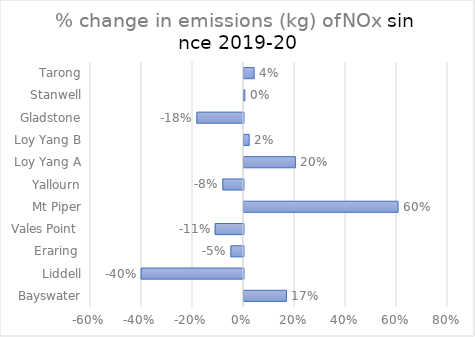
| Category | Series 0 |
|---|---|
| Bayswater | 0.166 |
| Liddell | -0.401 |
|  Eraring  | -0.05 |
| Vales Point  | -0.111 |
| Mt Piper | 0.604 |
| Yallourn | -0.081 |
| Loy Yang A | 0.202 |
| Loy Yang B | 0.02 |
| Gladstone | -0.183 |
| Stanwell | 0.003 |
| Tarong | 0.04 |